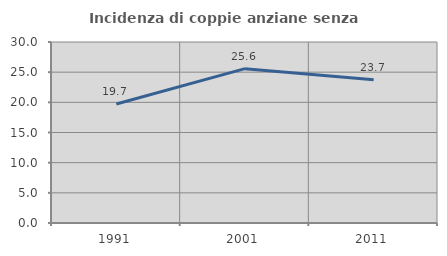
| Category | Incidenza di coppie anziane senza figli  |
|---|---|
| 1991.0 | 19.725 |
| 2001.0 | 25.581 |
| 2011.0 | 23.737 |